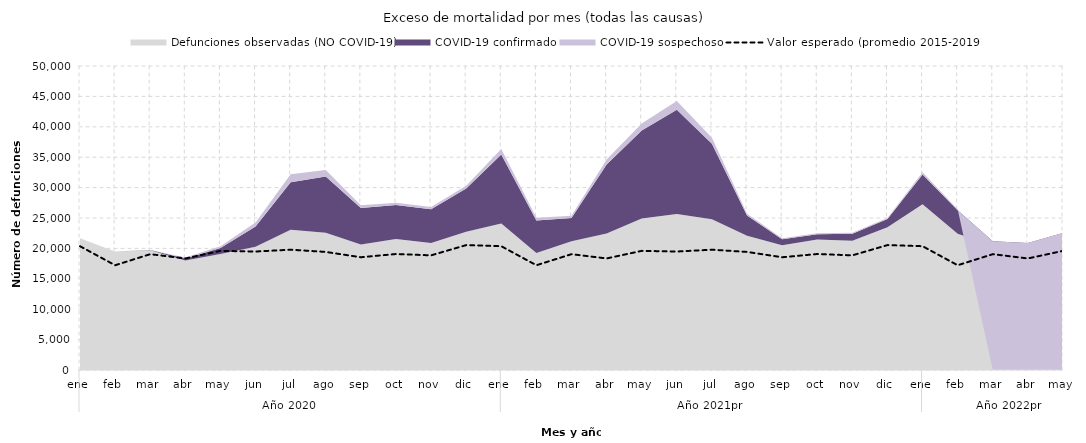
| Category | Valor esperado (promedio 2015-2019) |
|---|---|
| 0 | 20360.6 |
| 1 | 17229.2 |
| 2 | 19050 |
| 3 | 18346.2 |
| 4 | 19594.4 |
| 5 | 19486.2 |
| 6 | 19786.4 |
| 7 | 19420 |
| 8 | 18545.8 |
| 9 | 19074.4 |
| 10 | 18857 |
| 11 | 20542 |
| 12 | 20360.6 |
| 13 | 17229.2 |
| 14 | 19050 |
| 15 | 18346.2 |
| 16 | 19594.4 |
| 17 | 19486.2 |
| 18 | 19786.4 |
| 19 | 19420 |
| 20 | 18545.8 |
| 21 | 19074.4 |
| 22 | 18857 |
| 23 | 20542 |
| 24 | 20360.6 |
| 25 | 17229.2 |
| 26 | 19050 |
| 27 | 18346.2 |
| 28 | 19594.4 |